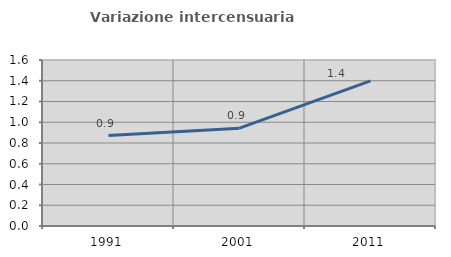
| Category | Variazione intercensuaria annua |
|---|---|
| 1991.0 | 0.872 |
| 2001.0 | 0.943 |
| 2011.0 | 1.399 |